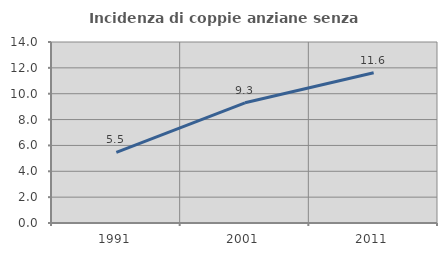
| Category | Incidenza di coppie anziane senza figli  |
|---|---|
| 1991.0 | 5.469 |
| 2001.0 | 9.297 |
| 2011.0 | 11.618 |